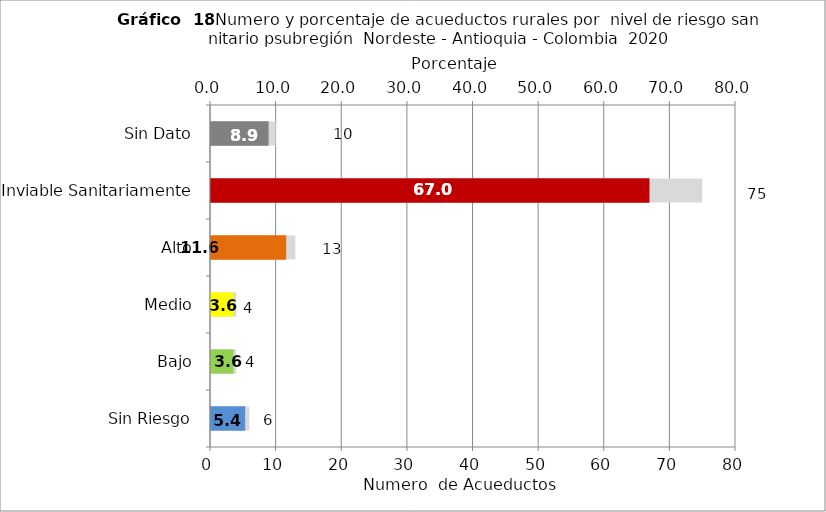
| Category | Número de Sistemas |
|---|---|
| Sin Riesgo | 6 |
| Bajo | 4 |
| Medio | 4 |
| Alto | 13 |
| Inviable Sanitariamente | 75 |
| Sin Dato | 10 |